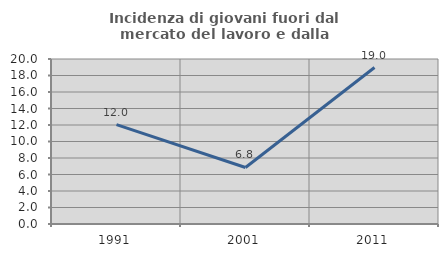
| Category | Incidenza di giovani fuori dal mercato del lavoro e dalla formazione  |
|---|---|
| 1991.0 | 12.048 |
| 2001.0 | 6.849 |
| 2011.0 | 18.966 |